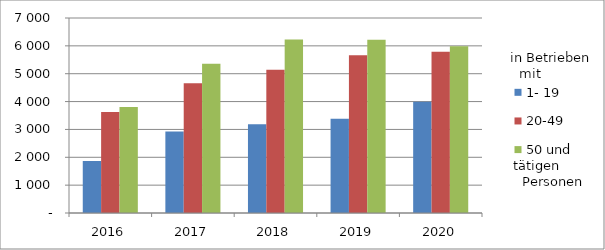
| Category | 1- 19 | 20-49 | 50 und mehr |
|---|---|---|---|
| 2016.0 | 1863 | 3623 | 3801 |
| 2017.0 | 2930 | 4661 | 5360 |
| 2018.0 | 3184 | 5139 | 6227 |
| 2019.0 | 3387 | 5663 | 6215 |
| 2020.0 | 3997 | 5786 | 5986 |